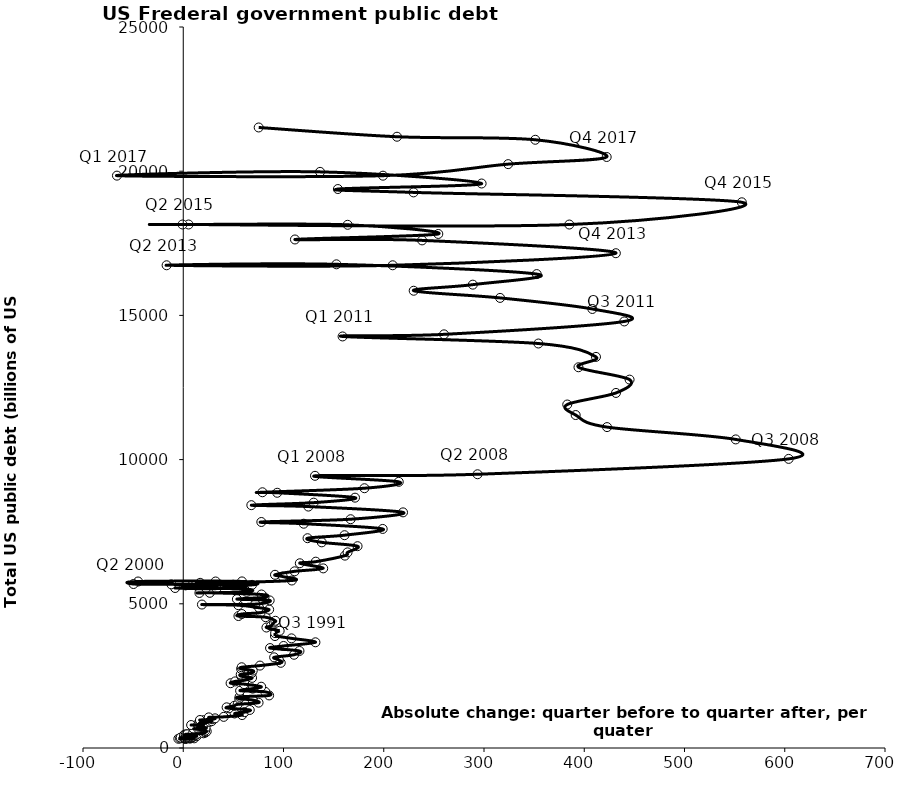
| Category | Series 0 |
|---|---|
| -4.902000000000044 | 320.999 |
| 1.8744999999999834 | 316.097 |
| 6.611000000000018 | 324.748 |
| 3.099500000000006 | 329.319 |
| -3.2130000000000223 | 330.947 |
| 2.474500000000006 | 322.893 |
| 10.88500000000002 | 335.896 |
| 6.788499999999999 | 344.663 |
| 0.35300000000000864 | 349.473 |
| 2.634999999999991 | 345.369 |
| 6.329999999999984 | 354.743 |
| 2.4014999999999986 | 358.029 |
| -2.5670000000000073 | 359.546 |
| 0.569500000000005 | 352.895 |
| 7.665500000000009 | 360.685 |
| 5.661000000000001 | 368.226 |
| 0.9339999999999975 | 372.007 |
| 3.335499999999996 | 370.094 |
| 9.53200000000001 | 378.678 |
| 6.4950000000000045 | 389.158 |
| 4.073499999999996 | 391.668 |
| 10.299999999999983 | 397.305 |
| 13.412999999999982 | 412.268 |
| 7.538000000000011 | 424.131 |
| 1.1520000000000152 | 427.344 |
| 3.301000000000016 | 426.435 |
| 11.019000000000005 | 433.946 |
| 12.329999999999984 | 448.473 |
| 4.421999999999997 | 458.606 |
| 1.0039999999999907 | 457.317 |
| 5.877999999999986 | 460.614 |
| 6.530500000000018 | 469.073 |
| 2.5810000000000173 | 473.675 |
| 3.8954999999999984 | 474.235 |
| 9.214499999999987 | 481.466 |
| 14.096499999999992 | 492.664 |
| 20.262 | 509.659 |
| 21.994000000000028 | 533.188 |
| 21.730500000000006 | 553.647 |
| 23.42149999999998 | 576.649 |
| 21.891500000000008 | 600.49 |
| 17.105500000000006 | 620.432 |
| 16.555499999999995 | 634.701 |
| 17.252999999999986 | 653.543 |
| 10.440999999999974 | 669.207 |
| 14.816500000000019 | 674.425 |
| 22.259000000000015 | 698.84 |
| 19.555499999999995 | 718.943 |
| 15.040500000000009 | 737.951 |
| 16.79649999999998 | 749.024 |
| 20.091499999999996 | 771.544 |
| 12.624000000000024 | 789.207 |
| 7.853000000000009 | 796.792 |
| 14.863499999999988 | 804.913 |
| 20.101499999999987 | 826.519 |
| 18.466000000000008 | 845.116 |
| 16.249000000000024 | 863.451 |
| 22.125 | 877.614 |
| 26.298000000000002 | 907.701 |
| 28.414999999999964 | 930.21 |
| 20.48199999999997 | 964.531 |
| 16.662000000000035 | 971.174 |
| 28.777500000000032 | 997.855 |
| 31.72199999999998 | 1028.729 |
| 25.450500000000034 | 1061.299 |
| 40.36800000000005 | 1079.63 |
| 58.72199999999998 | 1142.035 |
| 51.22899999999993 | 1197.074 |
| 61.25349999999992 | 1244.493 |
| 66.35900000000004 | 1319.581 |
| 45.56050000000005 | 1377.211 |
| 43.264999999999986 | 1410.702 |
| 50.997499999999945 | 1463.741 |
| 54.263000000000034 | 1512.697 |
| 75.1345 | 1572.267 |
| 69.23199999999997 | 1662.966 |
| 55.8370000000001 | 1710.731 |
| 56.186000000000035 | 1774.64 |
| 85.65099999999995 | 1823.103 |
| 81.85649999999998 | 1945.942 |
| 56.703500000000076 | 1986.816 |
| 69.24400000000003 | 2059.349 |
| 77.74299999999994 | 2125.304 |
| 60.710000000000036 | 2214.835 |
| 47.23049999999989 | 2246.724 |
| 51.77649999999994 | 2309.296 |
| 61.20950000000016 | 2350.277 |
| 68.63699999999994 | 2431.715 |
| 57.9704999999999 | 2487.551 |
| 57.31600000000003 | 2547.656 |
| 68.36799999999994 | 2602.183 |
| 69.35750000000007 | 2684.392 |
| 57.765499999999975 | 2740.898 |
| 58.26649999999995 | 2799.923 |
| 76.53550000000018 | 2857.431 |
| 97.26350000000002 | 2952.994 |
| 95.37999999999988 | 3051.958 |
| 90.67750000000001 | 3143.754 |
| 110.53300000000013 | 3233.313 |
| 115.93799999999987 | 3364.82 |
| 86.58399999999983 | 3465.189 |
| 100.05700000000002 | 3537.988 |
| 131.85500000000002 | 3665.303 |
| 107.99250000000006 | 3801.698 |
| 91.47900000000004 | 3881.288 |
| 91.66650000000004 | 3984.656 |
| 96.17650000000003 | 4064.621 |
| 82.97949999999992 | 4177.009 |
| 87.4704999999999 | 4230.58 |
| 90.45449999999983 | 4351.95 |
| 91.86850000000004 | 4411.489 |
| 82.19000000000005 | 4535.687 |
| 55.05749999999989 | 4575.869 |
| 58.440500000000156 | 4645.802 |
| 77.17399999999998 | 4692.75 |
| 85.68299999999999 | 4800.15 |
| 75.61100000000033 | 4864.116 |
| 54.933500000000095 | 4951.372 |
| 18.646499999999833 | 4973.983 |
| 71.90149999999994 | 4988.665 |
| 86.20550000000003 | 5117.786 |
| 53.51249999999982 | 5161.076 |
| 81.04799999999977 | 5224.811 |
| 78.03950000000032 | 5323.172 |
| 26.489500000000135 | 5380.89 |
| 16.1279999999997 | 5376.151 |
| 63.11850000000004 | 5413.146 |
| 64.64000000000033 | 5502.388 |
| 22.77350000000024 | 5542.426 |
| -8.116500000000087 | 5547.935 |
| 33.14099999999962 | 5526.193 |
| 62.710999999999785 | 5614.217 |
| 12.281500000000051 | 5651.615 |
| 2.3279999999999745 | 5638.78 |
| 68.6555000000003 | 5656.271 |
| 58.56050000000005 | 5776.091 |
| -45.076500000000124 | 5773.392 |
| -49.60649999999987 | 5685.938 |
| -11.860999999999876 | 5674.179 |
| 49.78049999999985 | 5662.216 |
| 32.299499999999625 | 5773.74 |
| 16.86200000000008 | 5726.815 |
| 108.31200000000035 | 5807.464 |
| 99.2840000000001 | 5943.439 |
| 91.51499999999987 | 6006.032 |
| 111.10199999999986 | 6126.469 |
| 139.61900000000014 | 6228.236 |
| 116.26999999999998 | 6405.707 |
| 132.20699999999988 | 6460.776 |
| 161.27199999999993 | 6670.121 |
| 163.92149999999992 | 6783.32 |
| 173.87400000000025 | 6997.964 |
| 138.18550000000005 | 7131.068 |
| 123.99249999999984 | 7274.335 |
| 160.904 | 7379.053 |
| 198.9430000000002 | 7596.143 |
| 120.17650000000003 | 7776.939 |
| 77.88549999999987 | 7836.496 |
| 166.95849999999973 | 7932.71 |
| 219.2230000000004 | 8170.413 |
| 124.81449999999995 | 8371.156 |
| 67.90899999999965 | 8420.042 |
| 130.09100000000035 | 8506.974 |
| 171.34550000000036 | 8680.224 |
| 93.72649999999976 | 8849.665 |
| 78.99399999999969 | 8867.677 |
| 180.7475000000004 | 9007.653 |
| 214.97049999999945 | 9229.172 |
| 131.41699999999946 | 9437.594 |
| 293.5655000000006 | 9492.006 |
| 603.8995000000004 | 10024.725 |
| 551.1080000000002 | 10699.805 |
| 422.7349999999997 | 11126.941 |
| 391.4434999999994 | 11545.275 |
| 383.03700000000026 | 11909.828 |
| 431.64750000000004 | 12311.349 |
| 445.22149999999965 | 12773.123 |
| 394.2494999999999 | 13201.792 |
| 411.71150000000034 | 13561.622 |
| 354.2460000000001 | 14025.215 |
| 158.9359999999997 | 14270.114 |
| 260.1130000000003 | 14343.087 |
| 439.9265000000005 | 14790.34 |
| 408.08899999999994 | 15222.94 |
| 316.0484999999999 | 15606.518 |
| 229.86099999999988 | 15855.037 |
| 288.84649999999965 | 16066.24 |
| 352.5705000000007 | 16432.73 |
| 152.79500000000007 | 16771.381 |
| -16.600500000000466 | 16738.32 |
| 208.89949999999953 | 16738.18 |
| 431.52349999999933 | 17156.119 |
| 238.2435000000005 | 17601.227 |
| 111.42200000000048 | 17632.606 |
| 254.41899999999987 | 17824.071 |
| 163.9925000000003 | 18141.444 |
| 5.277000000000044 | 18152.056 |
| -0.7190000000009604 | 18151.998 |
| 385.09050000000025 | 18150.618 |
| 557.1605 | 18922.179 |
| 229.70600000000013 | 19264.939 |
| 154.2530000000006 | 19381.591 |
| 297.6180000000004 | 19573.445 |
| 136.48749999999927 | 19976.827 |
| -66.13650000000052 | 19846.42 |
| 199.2400000000016 | 19844.554 |
| 324.09649999999965 | 20244.9 |
| 422.3714999999993 | 20492.747 |
| 351.16150000000016 | 21089.643 |
| 213.20750000000044 | 21195.07 |
| 75.25350000000071 | 21516.058 |